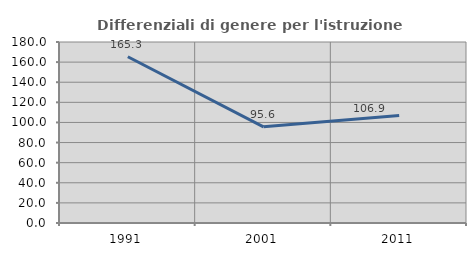
| Category | Differenziali di genere per l'istruzione superiore |
|---|---|
| 1991.0 | 165.315 |
| 2001.0 | 95.633 |
| 2011.0 | 106.946 |